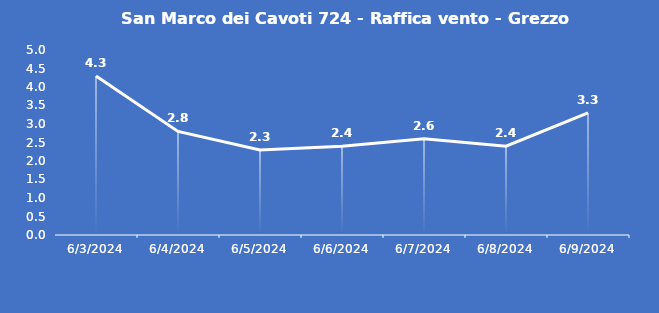
| Category | San Marco dei Cavoti 724 - Raffica vento - Grezzo (m/s) |
|---|---|
| 6/3/24 | 4.3 |
| 6/4/24 | 2.8 |
| 6/5/24 | 2.3 |
| 6/6/24 | 2.4 |
| 6/7/24 | 2.6 |
| 6/8/24 | 2.4 |
| 6/9/24 | 3.3 |